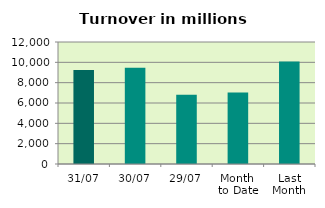
| Category | Series 0 |
|---|---|
| 31/07 | 9233.965 |
| 30/07 | 9475.631 |
| 29/07 | 6806.864 |
| Month 
to Date | 7041.386 |
| Last
Month | 10085.691 |